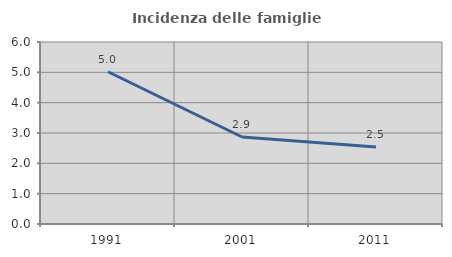
| Category | Incidenza delle famiglie numerose |
|---|---|
| 1991.0 | 5.019 |
| 2001.0 | 2.867 |
| 2011.0 | 2.542 |